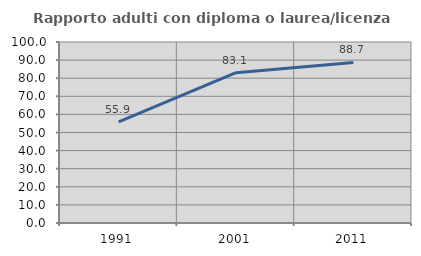
| Category | Rapporto adulti con diploma o laurea/licenza media  |
|---|---|
| 1991.0 | 55.882 |
| 2001.0 | 83.051 |
| 2011.0 | 88.732 |